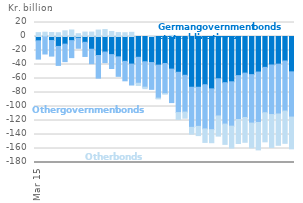
| Category | German government bonds | Other government bonds | Other bonds |
|---|---|---|---|
| 2015-03-01 | -6.2 | -26.1 | 5.5 |
| 2015-04-01 | 0.7 | -25 | 5.4 |
| 2015-05-01 | -5.8 | -22.2 | 5.7 |
| 2015-06-01 | -14.2 | -27.1 | 5.4 |
| 2015-07-01 | -10.9 | -25 | 8.1 |
| 2015-08-01 | -5.9 | -24.3 | 9.3 |
| 2015-09-01 | -2.4 | -14.4 | 4 |
| 2015-10-01 | -8.3 | -20.2 | 6.3 |
| 2015-11-01 | -18.2 | -20.7 | 6.3 |
| 2015-12-01 | -27.1 | -32.4 | 9.2 |
| 2016-01-01 | -22.2 | -15.2 | 9.9 |
| 2016-02-01 | -25.9 | -19.8 | 7.2 |
| 2016-03-01 | -29.1 | -27.8 | 5.6 |
| 2016-04-01 | -35.5 | -27.8 | 5.4 |
| 2016-05-01 | -39.4 | -29.9 | 6 |
| 2016-06-01 | -29.7 | -37.1 | -3.1 |
| 2016-07-01 | -36.1 | -36.3 | -2.1 |
| 2016-08-01 | -37.2 | -38.3 | 0.4 |
| 2016-09-01 | -40.9 | -47.2 | -1 |
| 2016-10-01 | -38.6 | -43 | -0.7 |
| 2016-11-01 | -46.6 | -47.8 | 1.6 |
| 2016-12-01 | -51.1 | -57.6 | -9.7 |
| 2017-01-01 | -55.4 | -52.6 | -8.7 |
| 2017-02-01 | -72.5 | -57.3 | -9.7 |
| 2017-03-01 | -72.5 | -55.9 | -13.2 |
| 2017-04-01 | -68.9 | -63.1 | -19.3 |
| 2017-05-01 | -74.8 | -58.3 | -18.6 |
| 2017-06-01 | -60.4 | -53.1 | -28.8 |
| 2017-07-01 | -66 | -59.1 | -29 |
| 2017-08-01 | -64.7 | -63.4 | -31.2 |
| 2017-09-01 | -55.9 | -62.7 | -34.3 |
| 2017-10-01 | -52.3 | -63.4 | -35.4 |
| 2017-11-01 | -54.5 | -69.2 | -35.4 |
| 2017-12-01 | -50.8 | -72 | -39.2 |
| 2018-01-01 | -44.1 | -64.8 | -41.6 |
| 2018-02-01 | -40.7 | -70.8 | -47 |
| 2018-03-01 | -39.5 | -71.2 | -44.7 |
| 2018-04-01 | -35 | -71.5 | -46.1 |
| 2018-05-01 | -50.5 | -64.6 | -45.4 |